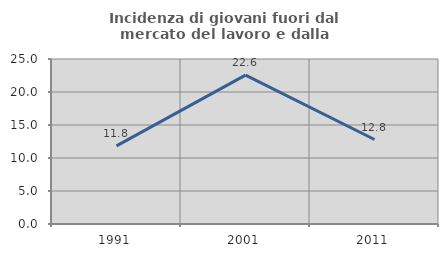
| Category | Incidenza di giovani fuori dal mercato del lavoro e dalla formazione  |
|---|---|
| 1991.0 | 11.837 |
| 2001.0 | 22.564 |
| 2011.0 | 12.8 |